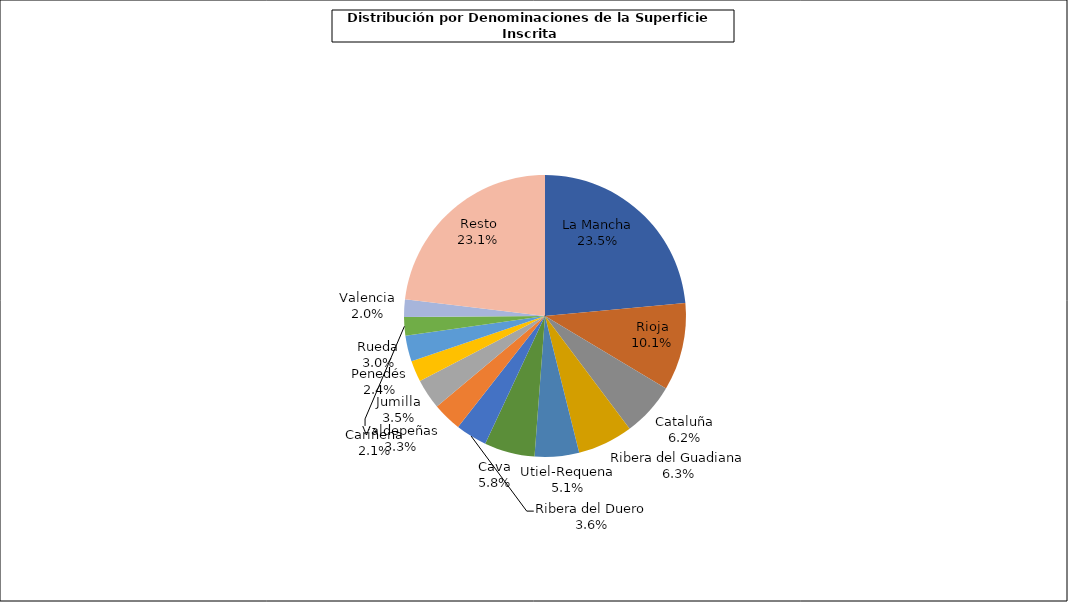
| Category | Series 0 |
|---|---|
| 0 | 155087 |
| 1 | 66271 |
| 2 | 40660 |
| 3 | 41810 |
| 4 | 33488 |
| 5 | 38152 |
| 6 | 23752 |
| 7 | 21957 |
| 8 | 22753 |
| 9 | 15993 |
| 10 | 19615 |
| 11 | 14064 |
| 12 | 13069 |
| 13 | 152345 |